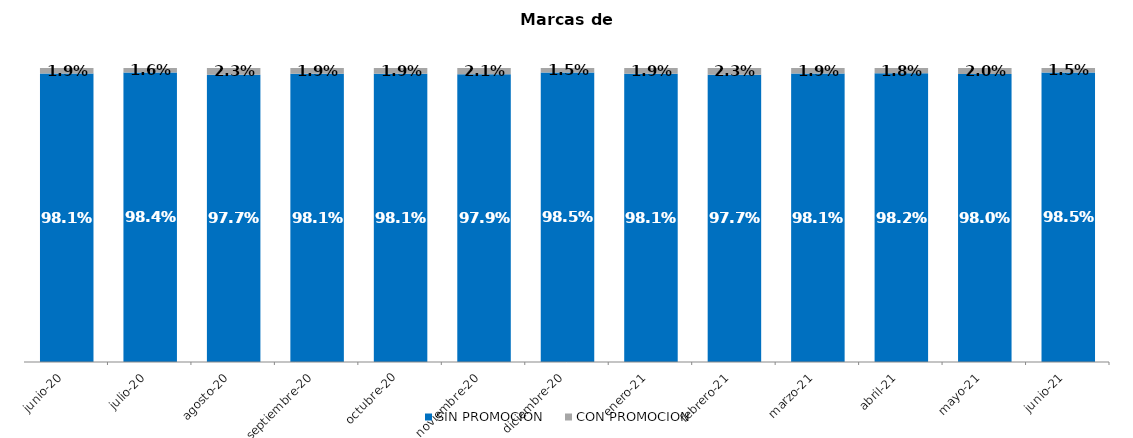
| Category | SIN PROMOCION   | CON PROMOCION   |
|---|---|---|
| 2020-06-01 | 0.981 | 0.019 |
| 2020-07-01 | 0.984 | 0.016 |
| 2020-08-01 | 0.977 | 0.023 |
| 2020-09-01 | 0.981 | 0.019 |
| 2020-10-01 | 0.981 | 0.019 |
| 2020-11-01 | 0.979 | 0.021 |
| 2020-12-01 | 0.985 | 0.015 |
| 2021-01-01 | 0.981 | 0.019 |
| 2021-02-01 | 0.977 | 0.023 |
| 2021-03-01 | 0.981 | 0.019 |
| 2021-04-01 | 0.982 | 0.018 |
| 2021-05-01 | 0.98 | 0.02 |
| 2021-06-01 | 0.985 | 0.015 |